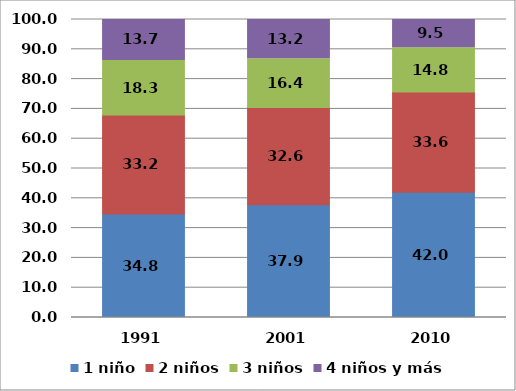
| Category | 1 niño | 2 niños | 3 niños | 4 niños y más |
|---|---|---|---|---|
| 1991.0 | 34.766 | 33.182 | 18.318 | 13.734 |
| 2001.0 | 37.871 | 32.569 | 16.403 | 13.157 |
| 2010.0 | 42.04 | 33.636 | 14.836 | 9.488 |